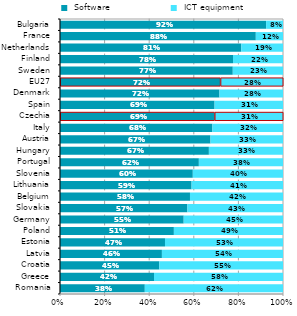
| Category |  Software |  ICT equipment |
|---|---|---|
| Romania | 0.38 | 0.62 |
| Greece | 0.422 | 0.578 |
| Croatia | 0.445 | 0.555 |
| Latvia | 0.457 | 0.543 |
| Estonia | 0.471 | 0.529 |
| Poland | 0.511 | 0.489 |
| Germany | 0.555 | 0.445 |
| Slovakia | 0.571 | 0.429 |
| Belgium | 0.583 | 0.417 |
| Lithuania | 0.59 | 0.41 |
| Slovenia | 0.596 | 0.404 |
| Portugal | 0.623 | 0.377 |
| Hungary | 0.668 | 0.332 |
| Austria | 0.675 | 0.325 |
| Italy | 0.683 | 0.317 |
| Czechia | 0.693 | 0.307 |
| Spain | 0.693 | 0.307 |
| Denmark | 0.715 | 0.285 |
| EU27 | 0.719 | 0.281 |
| Sweden | 0.775 | 0.225 |
| Finland | 0.776 | 0.224 |
| Netherlands | 0.813 | 0.187 |
| France | 0.878 | 0.122 |
| Bulgaria | 0.924 | 0.076 |